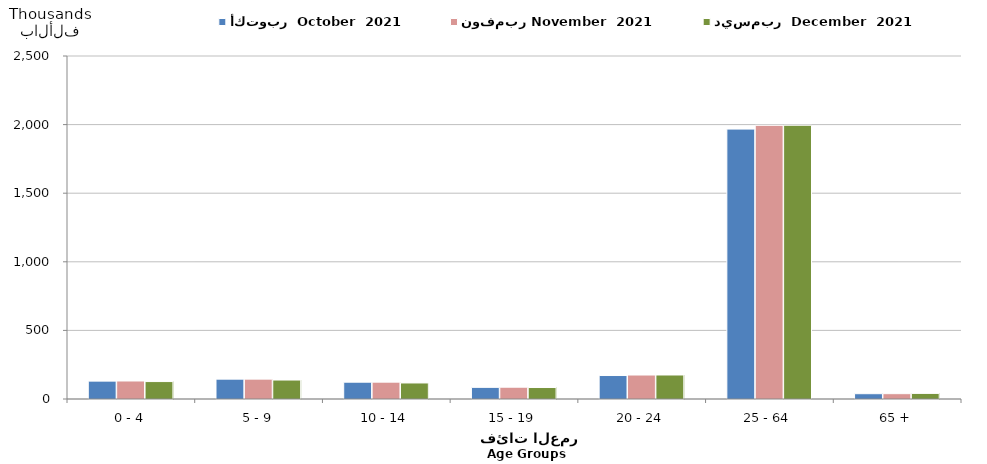
| Category | أكتوبر  October  2021 | نوفمبر November  2021  | ديسمبر  December  2021  |
|---|---|---|---|
| 0 - 4 | 130348 | 131301 | 127002 |
| 5 - 9 | 144534 | 144820 | 138275 |
| 10 - 14 | 122447 | 122763 | 116866 |
| 15 - 19 | 84927 | 85899 | 83604 |
| 20 - 24 | 171122 | 174794 | 175040 |
| 25 - 64 | 1967355 | 1994918 | 1995440 |
| 65 + | 38596 | 38806 | 40774 |